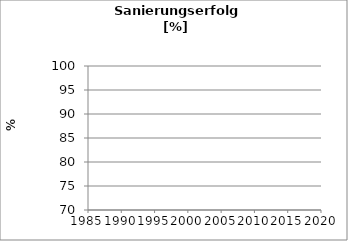
| Category | Series 1 |
|---|---|
| 1988.0 | 0 |
| 1989.0 | 0 |
| 1990.0 | 0 |
| 1991.0 | 0 |
| 1992.0 | 0 |
| 1993.0 | 0 |
| 1994.0 | 0 |
| 1995.0 | 0 |
| 1996.0 | 0 |
| 1997.0 | 0 |
| 1998.0 | 0 |
| 1999.0 | 0 |
| 2000.0 | 0 |
| 2001.0 | 0 |
| 2002.0 | 0 |
| 2003.0 | 0 |
| 2004.0 | 0 |
| 2005.0 | 0 |
| 2006.0 | 0 |
| 2007.0 | 0 |
| 2008.0 | 0 |
| 2009.0 | 0 |
| 2010.0 | 0 |
| 2011.0 | 0 |
| 2012.0 | 0 |
| 2013.0 | 0 |
| 2014.0 | 0 |
| 2015.0 | 0 |
| 2016.0 | 0 |
| 2017.0 | 0 |
| 2018.0 | 0 |
| 2019.0 | 0 |
| 2020.0 | 0 |